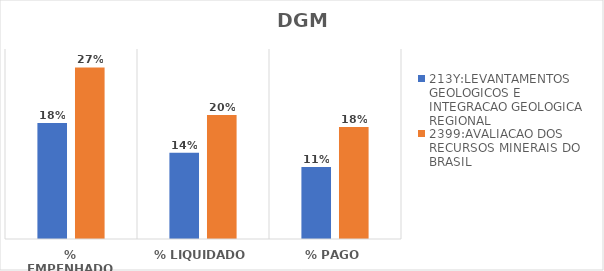
| Category | 213Y:LEVANTAMENTOS GEOLOGICOS E INTEGRACAO GEOLOGICA REGIONAL | 2399:AVALIACAO DOS RECURSOS MINERAIS DO BRASIL |
|---|---|---|
| % EMPENHADO | 0.183 | 0.271 |
| % LIQUIDADO | 0.136 | 0.196 |
| % PAGO | 0.114 | 0.177 |